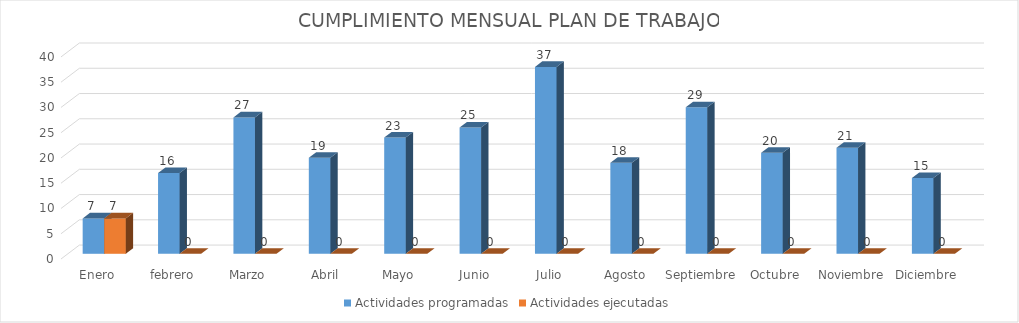
| Category | Actividades programadas | Actividades ejecutadas |
|---|---|---|
| Enero | 7 | 7 |
| febrero | 16 | 0 |
| Marzo | 27 | 0 |
|  Abril | 19 | 0 |
| Mayo | 23 | 0 |
| Junio | 25 | 0 |
| Julio | 37 | 0 |
| Agosto | 18 | 0 |
| Septiembre | 29 | 0 |
| Octubre | 20 | 0 |
| Noviembre | 21 | 0 |
| Diciembre | 15 | 0 |